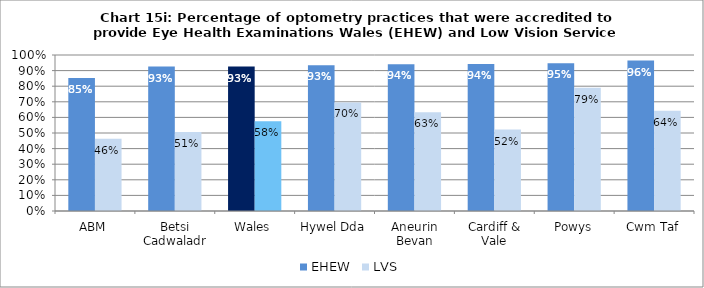
| Category | EHEW | LVS |
|---|---|---|
| ABM | 0.852 | 0.463 |
| Betsi Cadwaladr | 0.926 | 0.506 |
| Wales | 0.926 | 0.575 |
| Hywel Dda | 0.935 | 0.696 |
| Aneurin Bevan | 0.941 | 0.632 |
| Cardiff & Vale | 0.942 | 0.522 |
| Powys | 0.947 | 0.789 |
| Cwm Taf | 0.964 | 0.643 |